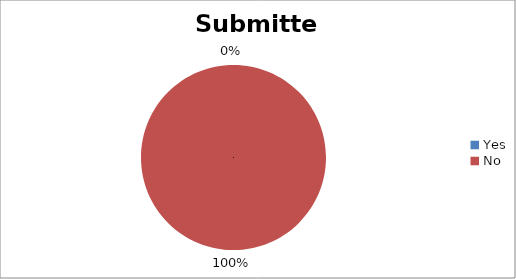
| Category | Submitted |
|---|---|
| Yes | 0 |
| No | 6 |